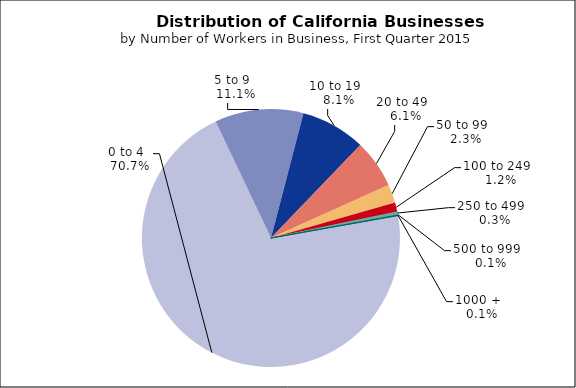
| Category | Series 0 |
|---|---|
| 0 to 4   | 0.707 |
| 5 to 9   | 0.111 |
| 10 to 19   | 0.081 |
| 20 to 49   | 0.061 |
| 50 to 99   | 0.023 |
| 100 to 249   | 0.012 |
| 250 to 499   | 0.003 |
| 500 to 999   | 0.001 |
| 1000 +   | 0.001 |